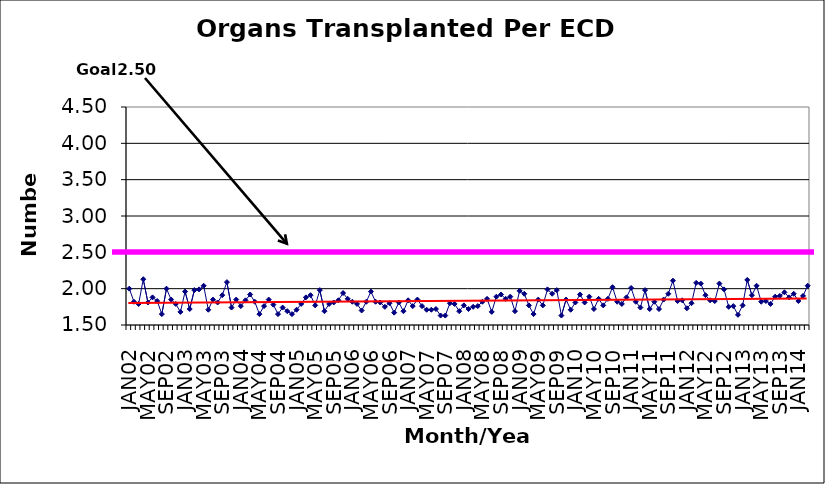
| Category | Series 0 |
|---|---|
| JAN02 | 2 |
| FEB02 | 1.82 |
| MAR02 | 1.79 |
| APR02 | 2.13 |
| MAY02 | 1.81 |
| JUN02 | 1.88 |
| JUL02 | 1.83 |
| AUG02 | 1.65 |
| SEP02 | 2 |
| OCT02 | 1.85 |
| NOV02 | 1.79 |
| DEC02 | 1.68 |
| JAN03 | 1.96 |
| FEB03 | 1.72 |
| MAR03 | 1.98 |
| APR03 | 1.99 |
| MAY03 | 2.04 |
| JUN03 | 1.71 |
| JUL03 | 1.85 |
| AUG03 | 1.81 |
| SEP03 | 1.91 |
| OCT03 | 2.09 |
| NOV03 | 1.74 |
| DEC03 | 1.85 |
| JAN04 | 1.76 |
| FEB04 | 1.84 |
| MAR04 | 1.92 |
| APR04 | 1.82 |
| MAY04 | 1.65 |
| JUN04 | 1.76 |
| JUL04 | 1.85 |
| AUG04 | 1.78 |
| SEP04 | 1.65 |
| OCT04 | 1.74 |
| NOV04 | 1.69 |
| DEC04 | 1.65 |
| JAN05 | 1.71 |
| FEB05 | 1.79 |
| MAR05 | 1.88 |
| APR05 | 1.91 |
| MAY05 | 1.77 |
| JUN05 | 1.98 |
| JUL05 | 1.69 |
| AUG05 | 1.79 |
| SEP05 | 1.81 |
| OCT05 | 1.84 |
| NOV05 | 1.94 |
| DEC05 | 1.86 |
| JAN06 | 1.82 |
| FEB06 | 1.79 |
| MAR06 | 1.7 |
| APR06 | 1.82 |
| MAY06 | 1.96 |
| JUN06 | 1.82 |
| JUL06 | 1.81 |
| AUG06 | 1.75 |
| SEP06 | 1.8 |
| OCT06 | 1.67 |
| NOV06 | 1.81 |
| DEC06 | 1.69 |
| JAN07 | 1.84 |
| FEB07 | 1.76 |
| MAR07 | 1.85 |
| APR07 | 1.76 |
| MAY07 | 1.71 |
| JUN07 | 1.71 |
| JUL07 | 1.72 |
| AUG07 | 1.63 |
| SEP07 | 1.63 |
| OCT07 | 1.8 |
| NOV07 | 1.79 |
| DEC07 | 1.69 |
| JAN08 | 1.77 |
| FEB08 | 1.72 |
| MAR08 | 1.75 |
| APR08 | 1.76 |
| MAY08 | 1.82 |
| JUN08 | 1.86 |
| JUL08 | 1.68 |
| AUG08 | 1.89 |
| SEP08 | 1.92 |
| OCT08 | 1.86 |
| NOV08 | 1.89 |
| DEC08 | 1.69 |
| JAN09 | 1.97 |
| FEB09 | 1.93 |
| MAR09 | 1.77 |
| APR09 | 1.65 |
| MAY09 | 1.85 |
| JUN09 | 1.77 |
| JUL09 | 1.99 |
| AUG09 | 1.93 |
| SEP09 | 1.98 |
| OCT09 | 1.63 |
| NOV09 | 1.85 |
| DEC09 | 1.71 |
| JAN10 | 1.81 |
| FEB10 | 1.92 |
| MAR10 | 1.81 |
| APR10 | 1.89 |
| MAY10 | 1.72 |
| JUN10 | 1.86 |
| JUL10 | 1.77 |
| AUG10 | 1.86 |
| SEP10 | 2.02 |
| OCT10 | 1.82 |
| NOV10 | 1.79 |
| DEC10 | 1.88 |
| JAN11 | 2.01 |
| FEB11 | 1.82 |
| MAR11 | 1.74 |
| APR11 | 1.98 |
| MAY11 | 1.72 |
| JUN11 | 1.82 |
| JUL11 | 1.72 |
| AUG11 | 1.85 |
| SEP11 | 1.93 |
| OCT11 | 2.11 |
| NOV11 | 1.83 |
| DEC11 | 1.84 |
| JAN12 | 1.73 |
| FEB12 | 1.8 |
| MAR12 | 2.08 |
| APR12 | 2.07 |
| MAY12 | 1.91 |
| JUN12 | 1.84 |
| JUL12 | 1.83 |
| AUG12 | 2.07 |
| SEP12 | 1.99 |
| OCT12 | 1.75 |
| NOV12 | 1.76 |
| DEC12 | 1.64 |
| JAN13 | 1.77 |
| FEB13 | 2.12 |
| MAR13 | 1.91 |
| APR13 | 2.04 |
| MAY13 | 1.82 |
| JUN13 | 1.83 |
| JUL13 | 1.79 |
| AUG13 | 1.89 |
| SEP13 | 1.9 |
| OCT13 | 1.95 |
| NOV13 | 1.88 |
| DEC13 | 1.93 |
| JAN14 | 1.83 |
| FEB14 | 1.9 |
| MAR14 | 2.04 |